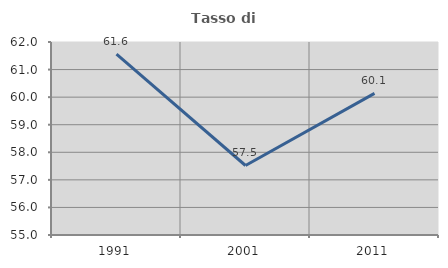
| Category | Tasso di occupazione   |
|---|---|
| 1991.0 | 61.561 |
| 2001.0 | 57.521 |
| 2011.0 | 60.137 |